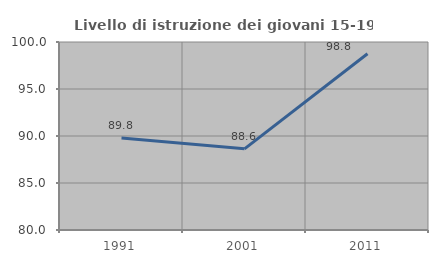
| Category | Livello di istruzione dei giovani 15-19 anni |
|---|---|
| 1991.0 | 89.781 |
| 2001.0 | 88.636 |
| 2011.0 | 98.75 |